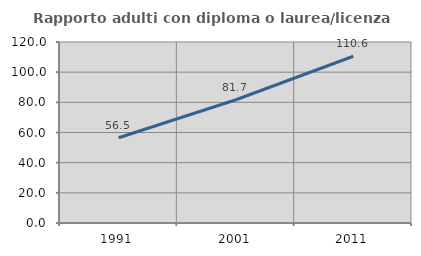
| Category | Rapporto adulti con diploma o laurea/licenza media  |
|---|---|
| 1991.0 | 56.548 |
| 2001.0 | 81.713 |
| 2011.0 | 110.553 |